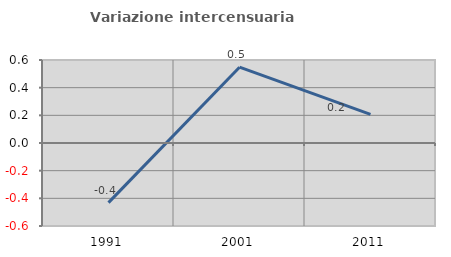
| Category | Variazione intercensuaria annua |
|---|---|
| 1991.0 | -0.431 |
| 2001.0 | 0.548 |
| 2011.0 | 0.207 |